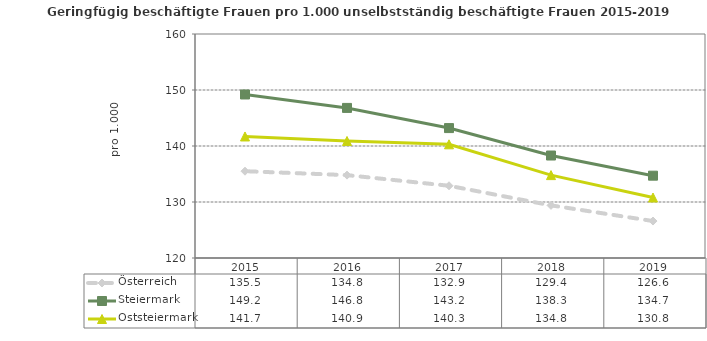
| Category | Österreich | Steiermark | Oststeiermark |
|---|---|---|---|
| 2019.0 | 126.6 | 134.7 | 130.8 |
| 2018.0 | 129.4 | 138.3 | 134.8 |
| 2017.0 | 132.9 | 143.2 | 140.3 |
| 2016.0 | 134.8 | 146.8 | 140.9 |
| 2015.0 | 135.5 | 149.2 | 141.7 |